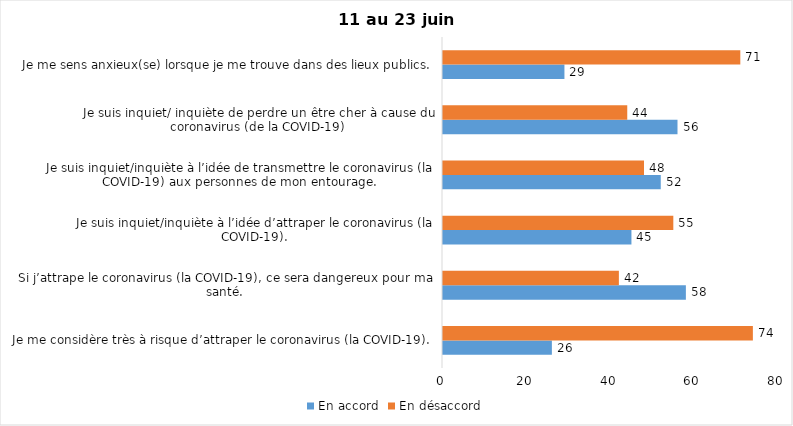
| Category | En accord | En désaccord |
|---|---|---|
| Je me considère très à risque d’attraper le coronavirus (la COVID-19). | 26 | 74 |
| Si j’attrape le coronavirus (la COVID-19), ce sera dangereux pour ma santé. | 58 | 42 |
| Je suis inquiet/inquiète à l’idée d’attraper le coronavirus (la COVID-19). | 45 | 55 |
| Je suis inquiet/inquiète à l’idée de transmettre le coronavirus (la COVID-19) aux personnes de mon entourage. | 52 | 48 |
| Je suis inquiet/ inquiète de perdre un être cher à cause du coronavirus (de la COVID-19) | 56 | 44 |
| Je me sens anxieux(se) lorsque je me trouve dans des lieux publics. | 29 | 71 |